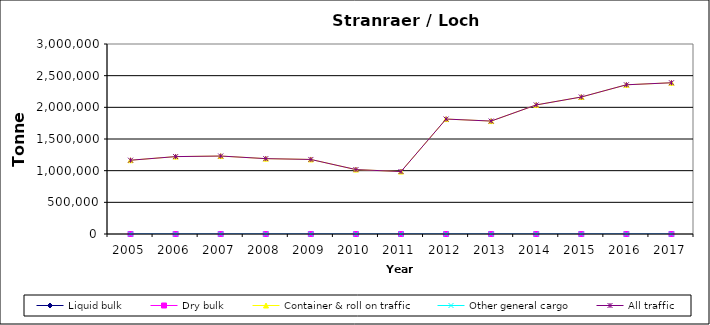
| Category | Liquid bulk | Dry bulk | Container & roll on traffic | Other general cargo | All traffic |
|---|---|---|---|---|---|
| 2005.0 | 0 | 0 | 1165000 | 0 | 1165000 |
| 2006.0 | 0 | 0 | 1222000 | 0 | 1222000 |
| 2007.0 | 0 | 0 | 1231000 | 0 | 1231000 |
| 2008.0 | 0 | 0 | 1190000 | 0 | 1190000 |
| 2009.0 | 0 | 0 | 1176987 | 0 | 1176987 |
| 2010.0 | 0 | 0 | 1017000 | 0 | 1017000 |
| 2011.0 | 0 | 0 | 986000 | 0 | 986000 |
| 2012.0 | 0 | 0 | 1815000 | 0 | 1815000 |
| 2013.0 | 0 | 0 | 1783000 | 0 | 1783000 |
| 2014.0 | 0 | 0 | 2038000 | 0 | 2038000 |
| 2015.0 | 0 | 0 | 2163000 | 0 | 2163000 |
| 2016.0 | 0 | 0 | 2356000 | 0 | 2356000 |
| 2017.0 | 0 | 0 | 2388000 | 0 | 2388000 |